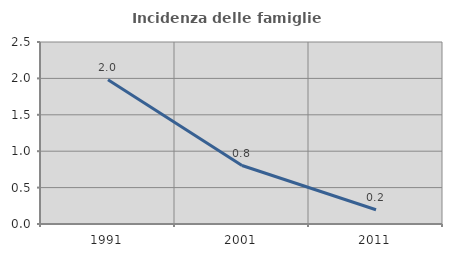
| Category | Incidenza delle famiglie numerose |
|---|---|
| 1991.0 | 1.982 |
| 2001.0 | 0.803 |
| 2011.0 | 0.196 |